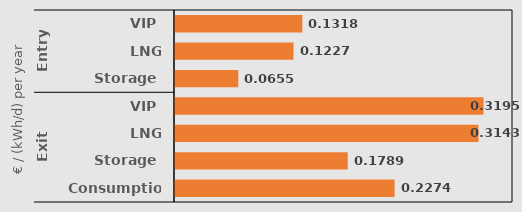
| Category | Series 0 |
|---|---|
| 0 | 0.132 |
| 1 | 0.123 |
| 2 | 0.066 |
| 3 | 0.319 |
| 4 | 0.314 |
| 5 | 0.179 |
| 6 | 0.227 |